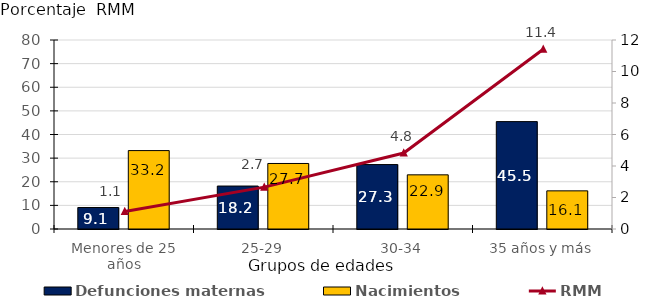
| Category | Defunciones maternas | Nacimientos |
|---|---|---|
| Menores de 25 años | 9.091 | 33.193 |
| 25-29 | 18.182 | 27.736 |
| 30-34 | 27.273 | 22.925 |
| 35 años y más | 45.455 | 16.147 |